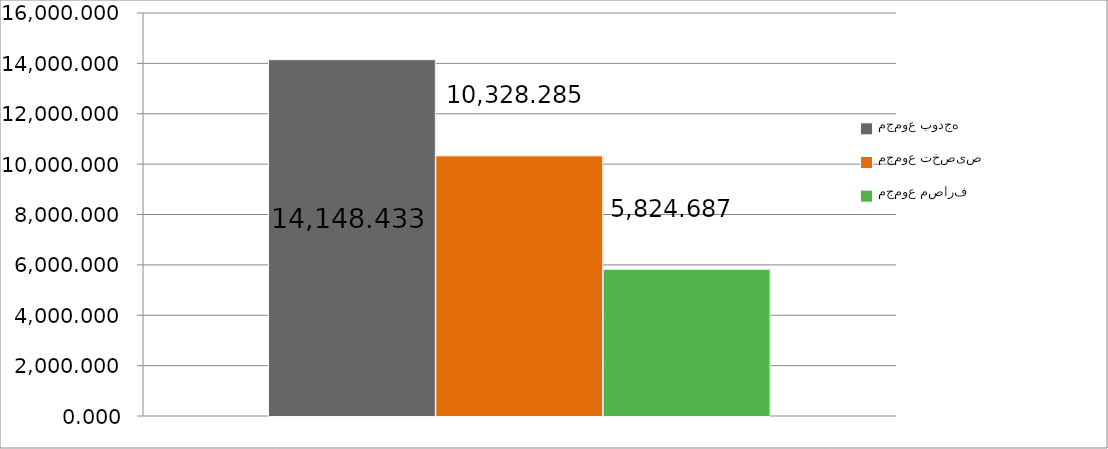
| Category | مجموع بودجه  | مجموع تخصیص | مجموع مصارف |
|---|---|---|---|
| 0 | 14148.433 | 10328.285 | 5824.687 |